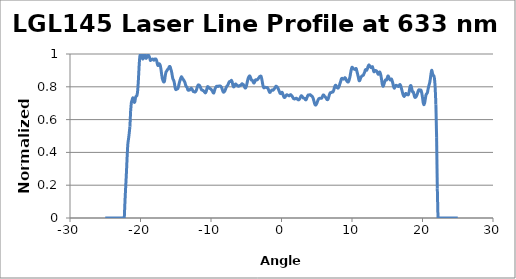
| Category | Normalized Intensity |
|---|---|
| -25.0 | 0 |
| -24.9 | 0 |
| -24.8 | 0 |
| -24.7 | 0 |
| -24.6 | 0 |
| -24.5 | 0 |
| -24.4 | 0 |
| -24.3 | 0 |
| -24.2 | 0 |
| -24.1 | 0 |
| -24.0 | 0 |
| -23.9 | 0 |
| -23.8 | 0 |
| -23.7 | 0 |
| -23.6 | 0 |
| -23.5 | 0 |
| -23.4 | 0 |
| -23.3 | 0 |
| -23.2 | 0 |
| -23.1 | 0 |
| -23.0 | 0 |
| -22.9 | 0 |
| -22.8 | 0 |
| -22.7 | 0 |
| -22.6 | 0 |
| -22.5 | 0 |
| -22.4 | 0 |
| -22.3 | 0 |
| -22.2 | 0.104 |
| -22.1 | 0.191 |
| -22.0 | 0.273 |
| -21.9 | 0.369 |
| -21.8 | 0.449 |
| -21.7 | 0.482 |
| -21.6 | 0.517 |
| -21.5 | 0.559 |
| -21.4 | 0.652 |
| -21.3 | 0.702 |
| -21.2 | 0.717 |
| -21.1 | 0.733 |
| -21.0 | 0.722 |
| -20.9 | 0.706 |
| -20.8 | 0.71 |
| -20.7 | 0.736 |
| -20.6 | 0.742 |
| -20.5 | 0.748 |
| -20.4 | 0.777 |
| -20.3 | 0.84 |
| -20.2 | 0.923 |
| -20.1 | 0.983 |
| -20.0 | 0.998 |
| -19.9 | 1 |
| -19.8 | 0.99 |
| -19.7 | 0.97 |
| -19.6 | 0.975 |
| -19.5 | 0.995 |
| -19.4 | 0.994 |
| -19.3 | 0.978 |
| -19.2 | 0.973 |
| -19.1 | 0.98 |
| -19.0 | 0.995 |
| -18.9 | 0.994 |
| -18.8 | 0.988 |
| -18.7 | 0.977 |
| -18.6 | 0.961 |
| -18.5 | 0.967 |
| -18.4 | 0.967 |
| -18.3 | 0.969 |
| -18.2 | 0.968 |
| -18.1 | 0.962 |
| -18.0 | 0.969 |
| -17.9 | 0.97 |
| -17.8 | 0.969 |
| -17.7 | 0.958 |
| -17.6 | 0.937 |
| -17.5 | 0.93 |
| -17.4 | 0.94 |
| -17.3 | 0.939 |
| -17.2 | 0.931 |
| -17.1 | 0.908 |
| -17.0 | 0.876 |
| -16.9 | 0.85 |
| -16.8 | 0.836 |
| -16.7 | 0.829 |
| -16.6 | 0.834 |
| -16.5 | 0.863 |
| -16.4 | 0.887 |
| -16.3 | 0.895 |
| -16.2 | 0.903 |
| -16.1 | 0.909 |
| -16.0 | 0.914 |
| -15.9 | 0.923 |
| -15.8 | 0.922 |
| -15.7 | 0.908 |
| -15.6 | 0.893 |
| -15.5 | 0.869 |
| -15.4 | 0.848 |
| -15.3 | 0.84 |
| -15.2 | 0.824 |
| -15.1 | 0.797 |
| -15.0 | 0.783 |
| -14.9 | 0.784 |
| -14.8 | 0.787 |
| -14.7 | 0.79 |
| -14.6 | 0.804 |
| -14.5 | 0.823 |
| -14.4 | 0.838 |
| -14.3 | 0.852 |
| -14.2 | 0.861 |
| -14.1 | 0.856 |
| -14.0 | 0.847 |
| -13.9 | 0.842 |
| -13.8 | 0.835 |
| -13.7 | 0.827 |
| -13.6 | 0.81 |
| -13.5 | 0.801 |
| -13.4 | 0.798 |
| -13.3 | 0.782 |
| -13.2 | 0.778 |
| -13.1 | 0.781 |
| -13.0 | 0.781 |
| -12.9 | 0.788 |
| -12.8 | 0.792 |
| -12.7 | 0.787 |
| -12.6 | 0.778 |
| -12.5 | 0.771 |
| -12.4 | 0.77 |
| -12.3 | 0.768 |
| -12.2 | 0.77 |
| -12.1 | 0.777 |
| -12.0 | 0.791 |
| -11.9 | 0.804 |
| -11.8 | 0.811 |
| -11.7 | 0.81 |
| -11.6 | 0.806 |
| -11.5 | 0.798 |
| -11.4 | 0.787 |
| -11.3 | 0.78 |
| -11.2 | 0.779 |
| -11.1 | 0.776 |
| -11.0 | 0.773 |
| -10.9 | 0.767 |
| -10.8 | 0.763 |
| -10.7 | 0.769 |
| -10.6 | 0.785 |
| -10.5 | 0.8 |
| -10.4 | 0.8 |
| -10.3 | 0.795 |
| -10.2 | 0.791 |
| -10.1 | 0.789 |
| -10.0 | 0.785 |
| -9.9 | 0.779 |
| -9.8 | 0.774 |
| -9.7 | 0.765 |
| -9.6 | 0.763 |
| -9.5 | 0.777 |
| -9.4 | 0.791 |
| -9.3 | 0.799 |
| -9.2 | 0.803 |
| -9.1 | 0.803 |
| -9.0 | 0.802 |
| -8.9 | 0.804 |
| -8.8 | 0.804 |
| -8.7 | 0.805 |
| -8.6 | 0.802 |
| -8.5 | 0.796 |
| -8.4 | 0.783 |
| -8.3 | 0.771 |
| -8.2 | 0.767 |
| -8.1 | 0.771 |
| -8.0 | 0.778 |
| -7.9 | 0.79 |
| -7.8 | 0.8 |
| -7.7 | 0.806 |
| -7.6 | 0.811 |
| -7.5 | 0.823 |
| -7.4 | 0.831 |
| -7.3 | 0.832 |
| -7.2 | 0.834 |
| -7.1 | 0.839 |
| -7.0 | 0.83 |
| -6.9 | 0.81 |
| -6.8 | 0.8 |
| -6.7 | 0.802 |
| -6.6 | 0.813 |
| -6.5 | 0.818 |
| -6.4 | 0.812 |
| -6.3 | 0.809 |
| -6.2 | 0.805 |
| -6.1 | 0.803 |
| -6.0 | 0.805 |
| -5.9 | 0.808 |
| -5.8 | 0.808 |
| -5.7 | 0.813 |
| -5.6 | 0.819 |
| -5.5 | 0.816 |
| -5.4 | 0.812 |
| -5.3 | 0.804 |
| -5.2 | 0.795 |
| -5.1 | 0.793 |
| -5.0 | 0.802 |
| -4.9 | 0.82 |
| -4.8 | 0.84 |
| -4.7 | 0.855 |
| -4.6 | 0.863 |
| -4.5 | 0.866 |
| -4.4 | 0.858 |
| -4.3 | 0.842 |
| -4.2 | 0.841 |
| -4.1 | 0.838 |
| -4.0 | 0.827 |
| -3.9 | 0.823 |
| -3.8 | 0.83 |
| -3.7 | 0.841 |
| -3.6 | 0.844 |
| -3.5 | 0.841 |
| -3.4 | 0.845 |
| -3.3 | 0.85 |
| -3.2 | 0.856 |
| -3.1 | 0.862 |
| -3.0 | 0.864 |
| -2.9 | 0.864 |
| -2.8 | 0.848 |
| -2.7 | 0.824 |
| -2.6 | 0.803 |
| -2.5 | 0.794 |
| -2.4 | 0.796 |
| -2.3 | 0.797 |
| -2.2 | 0.796 |
| -2.1 | 0.796 |
| -2.0 | 0.795 |
| -1.9 | 0.788 |
| -1.8 | 0.777 |
| -1.7 | 0.767 |
| -1.6 | 0.767 |
| -1.5 | 0.775 |
| -1.4 | 0.778 |
| -1.3 | 0.781 |
| -1.2 | 0.779 |
| -1.1 | 0.783 |
| -1.0 | 0.79 |
| -0.9 | 0.795 |
| -0.8 | 0.803 |
| -0.7 | 0.802 |
| -0.6 | 0.798 |
| -0.5 | 0.792 |
| -0.4 | 0.781 |
| -0.3 | 0.77 |
| -0.2 | 0.761 |
| -0.1 | 0.759 |
| 0.0 | 0.764 |
| 0.1 | 0.766 |
| 0.2 | 0.753 |
| 0.3 | 0.741 |
| 0.4 | 0.735 |
| 0.5 | 0.737 |
| 0.6 | 0.744 |
| 0.7 | 0.75 |
| 0.8 | 0.751 |
| 0.9 | 0.748 |
| 1.0 | 0.746 |
| 1.1 | 0.745 |
| 1.2 | 0.749 |
| 1.3 | 0.752 |
| 1.4 | 0.748 |
| 1.5 | 0.743 |
| 1.6 | 0.736 |
| 1.7 | 0.728 |
| 1.8 | 0.726 |
| 1.9 | 0.726 |
| 2.0 | 0.728 |
| 2.1 | 0.731 |
| 2.2 | 0.727 |
| 2.3 | 0.723 |
| 2.4 | 0.72 |
| 2.5 | 0.722 |
| 2.6 | 0.728 |
| 2.7 | 0.738 |
| 2.8 | 0.745 |
| 2.9 | 0.743 |
| 3.0 | 0.737 |
| 3.1 | 0.732 |
| 3.2 | 0.731 |
| 3.3 | 0.728 |
| 3.4 | 0.721 |
| 3.5 | 0.722 |
| 3.6 | 0.733 |
| 3.7 | 0.744 |
| 3.8 | 0.75 |
| 3.9 | 0.749 |
| 4.0 | 0.751 |
| 4.1 | 0.751 |
| 4.2 | 0.746 |
| 4.3 | 0.744 |
| 4.4 | 0.739 |
| 4.5 | 0.728 |
| 4.6 | 0.713 |
| 4.7 | 0.696 |
| 4.8 | 0.689 |
| 4.9 | 0.69 |
| 5.0 | 0.698 |
| 5.1 | 0.71 |
| 5.2 | 0.721 |
| 5.3 | 0.727 |
| 5.4 | 0.73 |
| 5.5 | 0.731 |
| 5.6 | 0.731 |
| 5.7 | 0.731 |
| 5.8 | 0.74 |
| 5.9 | 0.749 |
| 6.0 | 0.749 |
| 6.1 | 0.743 |
| 6.2 | 0.739 |
| 6.3 | 0.733 |
| 6.4 | 0.725 |
| 6.5 | 0.721 |
| 6.6 | 0.724 |
| 6.7 | 0.738 |
| 6.8 | 0.752 |
| 6.9 | 0.763 |
| 7.0 | 0.765 |
| 7.1 | 0.766 |
| 7.2 | 0.769 |
| 7.3 | 0.769 |
| 7.4 | 0.778 |
| 7.5 | 0.794 |
| 7.6 | 0.806 |
| 7.7 | 0.809 |
| 7.8 | 0.801 |
| 7.9 | 0.795 |
| 8.0 | 0.792 |
| 8.1 | 0.796 |
| 8.2 | 0.807 |
| 8.3 | 0.821 |
| 8.4 | 0.834 |
| 8.5 | 0.849 |
| 8.6 | 0.852 |
| 8.7 | 0.849 |
| 8.8 | 0.847 |
| 8.9 | 0.85 |
| 9.0 | 0.856 |
| 9.1 | 0.851 |
| 9.2 | 0.84 |
| 9.3 | 0.833 |
| 9.4 | 0.829 |
| 9.5 | 0.831 |
| 9.6 | 0.842 |
| 9.7 | 0.859 |
| 9.8 | 0.883 |
| 9.9 | 0.906 |
| 10.0 | 0.919 |
| 10.1 | 0.915 |
| 10.2 | 0.91 |
| 10.3 | 0.909 |
| 10.4 | 0.906 |
| 10.5 | 0.91 |
| 10.6 | 0.911 |
| 10.7 | 0.893 |
| 10.8 | 0.877 |
| 10.9 | 0.858 |
| 11.0 | 0.838 |
| 11.1 | 0.838 |
| 11.2 | 0.851 |
| 11.3 | 0.861 |
| 11.4 | 0.865 |
| 11.5 | 0.868 |
| 11.6 | 0.87 |
| 11.7 | 0.88 |
| 11.8 | 0.89 |
| 11.9 | 0.904 |
| 12.0 | 0.905 |
| 12.1 | 0.902 |
| 12.2 | 0.913 |
| 12.3 | 0.926 |
| 12.4 | 0.934 |
| 12.5 | 0.928 |
| 12.6 | 0.921 |
| 12.7 | 0.917 |
| 12.8 | 0.919 |
| 12.9 | 0.922 |
| 13.0 | 0.908 |
| 13.1 | 0.892 |
| 13.2 | 0.893 |
| 13.3 | 0.899 |
| 13.4 | 0.898 |
| 13.5 | 0.895 |
| 13.6 | 0.887 |
| 13.7 | 0.877 |
| 13.8 | 0.88 |
| 13.9 | 0.89 |
| 14.0 | 0.885 |
| 14.1 | 0.868 |
| 14.2 | 0.842 |
| 14.3 | 0.815 |
| 14.4 | 0.803 |
| 14.5 | 0.81 |
| 14.6 | 0.825 |
| 14.7 | 0.838 |
| 14.8 | 0.844 |
| 14.9 | 0.841 |
| 15.0 | 0.854 |
| 15.1 | 0.866 |
| 15.2 | 0.86 |
| 15.3 | 0.849 |
| 15.4 | 0.842 |
| 15.5 | 0.842 |
| 15.6 | 0.848 |
| 15.7 | 0.836 |
| 15.8 | 0.82 |
| 15.9 | 0.8 |
| 16.0 | 0.791 |
| 16.1 | 0.8 |
| 16.2 | 0.808 |
| 16.3 | 0.808 |
| 16.4 | 0.806 |
| 16.5 | 0.803 |
| 16.6 | 0.802 |
| 16.7 | 0.807 |
| 16.8 | 0.815 |
| 16.9 | 0.807 |
| 17.0 | 0.792 |
| 17.1 | 0.775 |
| 17.2 | 0.759 |
| 17.3 | 0.746 |
| 17.4 | 0.741 |
| 17.5 | 0.748 |
| 17.6 | 0.759 |
| 17.7 | 0.758 |
| 17.8 | 0.752 |
| 17.9 | 0.751 |
| 18.0 | 0.752 |
| 18.1 | 0.769 |
| 18.2 | 0.794 |
| 18.3 | 0.807 |
| 18.4 | 0.803 |
| 18.5 | 0.782 |
| 18.6 | 0.769 |
| 18.7 | 0.768 |
| 18.8 | 0.752 |
| 18.9 | 0.737 |
| 19.0 | 0.736 |
| 19.1 | 0.74 |
| 19.2 | 0.749 |
| 19.3 | 0.762 |
| 19.4 | 0.776 |
| 19.5 | 0.782 |
| 19.6 | 0.775 |
| 19.7 | 0.78 |
| 19.8 | 0.778 |
| 19.9 | 0.761 |
| 20.0 | 0.735 |
| 20.1 | 0.703 |
| 20.2 | 0.69 |
| 20.3 | 0.701 |
| 20.4 | 0.725 |
| 20.5 | 0.751 |
| 20.6 | 0.758 |
| 20.7 | 0.766 |
| 20.8 | 0.788 |
| 20.9 | 0.806 |
| 21.0 | 0.822 |
| 21.1 | 0.845 |
| 21.2 | 0.877 |
| 21.3 | 0.901 |
| 21.4 | 0.887 |
| 21.5 | 0.869 |
| 21.6 | 0.867 |
| 21.7 | 0.849 |
| 21.8 | 0.792 |
| 21.9 | 0.691 |
| 22.0 | 0.493 |
| 22.1 | 0.181 |
| 22.2 | 0 |
| 22.3 | 0 |
| 22.4 | 0 |
| 22.5 | 0 |
| 22.6 | 0 |
| 22.7 | 0 |
| 22.8 | 0 |
| 22.9 | 0 |
| 23.0 | 0 |
| 23.1 | 0 |
| 23.2 | 0 |
| 23.3 | 0 |
| 23.4 | 0 |
| 23.5 | 0 |
| 23.6 | 0 |
| 23.7 | 0 |
| 23.8 | 0 |
| 23.9 | 0 |
| 24.0 | 0 |
| 24.1 | 0 |
| 24.2 | 0 |
| 24.3 | 0 |
| 24.4 | 0 |
| 24.5 | 0 |
| 24.6 | 0 |
| 24.7 | 0 |
| 24.8 | 0 |
| 24.9 | 0 |
| 25.0 | 0 |